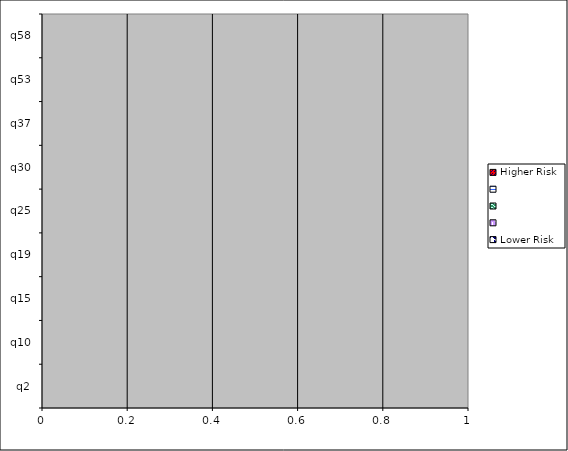
| Category | Higher Risk |   | Lower Risk |
|---|---|---|---|
| q2 | 0 | 0 | 0 |
| q10 | 0 | 0 | 0 |
| q15 | 0 | 0 | 0 |
| q19 | 0 | 0 | 0 |
| q25 | 0 | 0 | 0 |
| q30 | 0 | 0 | 0 |
| q37 | 0 | 0 | 0 |
| q53 | 0 | 0 | 0 |
| q58 | 0 | 0 | 0 |